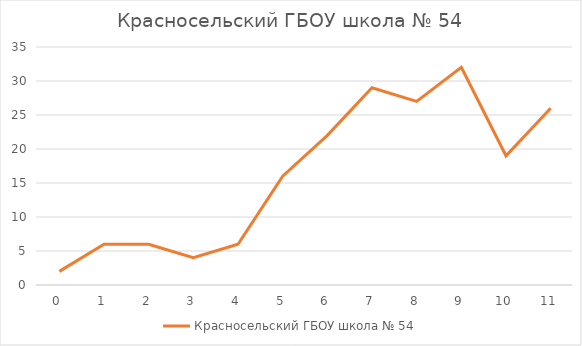
| Category | Красносельский |
|---|---|
| 0.0 | 2 |
| 1.0 | 6 |
| 2.0 | 6 |
| 3.0 | 4 |
| 4.0 | 6 |
| 5.0 | 16 |
| 6.0 | 22 |
| 7.0 | 29 |
| 8.0 | 27 |
| 9.0 | 32 |
| 10.0 | 19 |
| 11.0 | 26 |